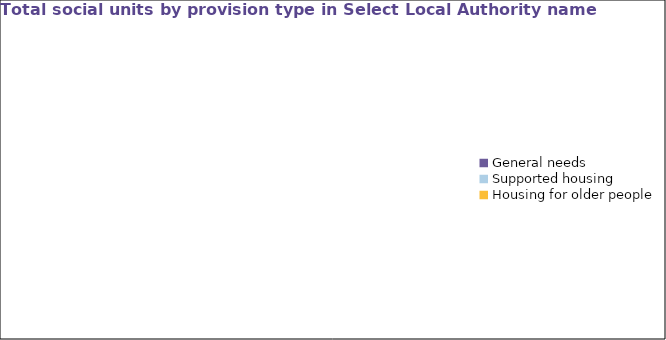
| Category | Series 0 |
|---|---|
| General needs | 0 |
| Supported housing | 0 |
| Housing for older people | 0 |